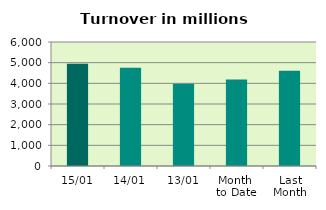
| Category | Series 0 |
|---|---|
| 15/01 | 4947.943 |
| 14/01 | 4753.626 |
| 13/01 | 3982.861 |
| Month 
to Date | 4180.245 |
| Last
Month | 4613.793 |